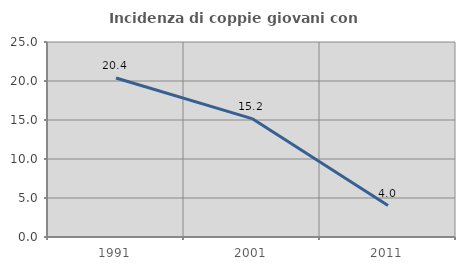
| Category | Incidenza di coppie giovani con figli |
|---|---|
| 1991.0 | 20.388 |
| 2001.0 | 15.179 |
| 2011.0 | 4.032 |